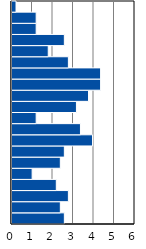
| Category | Series 0 |
|---|---|
| 0-4 | 2.554 |
| 5-9 | 2.358 |
| 10-14 | 2.75 |
| 15-19 | 2.161 |
| 20-24 | 0.982 |
| 25-29 | 2.358 |
| 30-34 | 2.554 |
| 35-39 | 3.929 |
| 40-44 | 3.34 |
| 45-49 | 1.179 |
| 50-54 | 3.143 |
| 55-59 | 3.733 |
| 60-64 | 4.322 |
| 65-69 | 4.322 |
| 70-74 | 2.75 |
| 75-79 | 1.768 |
| 80-84 | 2.554 |
| 85-89 | 1.179 |
| 90-94 | 1.179 |
| 95+ | 0.196 |